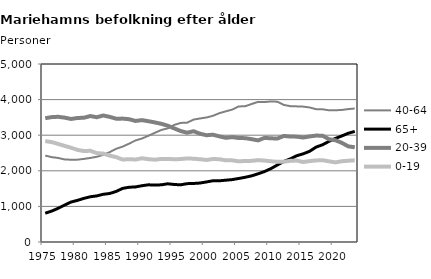
| Category | 40-64 | 65+ | 20-39 | 0-19 |
|---|---|---|---|---|
| 1975.0 | 2428 | 809 | 3478 | 2835 |
| 1976.0 | 2384 | 868 | 3508 | 2806 |
| 1977.0 | 2361 | 946 | 3517 | 2755 |
| 1978.0 | 2319 | 1037 | 3494 | 2700 |
| 1979.0 | 2311 | 1123 | 3456 | 2648 |
| 1980.0 | 2313 | 1169 | 3483 | 2588 |
| 1981.0 | 2334 | 1226 | 3491 | 2555 |
| 1982.0 | 2362 | 1271 | 3538 | 2562 |
| 1983.0 | 2394 | 1295 | 3505 | 2497 |
| 1984.0 | 2447 | 1340 | 3554 | 2483 |
| 1985.0 | 2525 | 1363 | 3515 | 2426 |
| 1986.0 | 2619 | 1420 | 3464 | 2385 |
| 1987.0 | 2679 | 1506 | 3466 | 2315 |
| 1988.0 | 2762 | 1538 | 3450 | 2327 |
| 1989.0 | 2853 | 1547 | 3400 | 2317 |
| 1990.0 | 2907 | 1581 | 3424 | 2351 |
| 1991.0 | 2984 | 1606 | 3393 | 2327 |
| 1992.0 | 3067 | 1600 | 3359 | 2312 |
| 1993.0 | 3147 | 1606 | 3320 | 2333 |
| 1994.0 | 3192 | 1635 | 3267 | 2335 |
| 1995.0 | 3288 | 1616 | 3191 | 2323 |
| 1996.0 | 3345 | 1606 | 3118 | 2330 |
| 1997.0 | 3351 | 1639 | 3070 | 2348 |
| 1998.0 | 3438 | 1644 | 3112 | 2340 |
| 1999.0 | 3470 | 1656 | 3042 | 2324 |
| 2000.0 | 3498 | 1687 | 2999 | 2304 |
| 2001.0 | 3544 | 1720 | 3014 | 2331 |
| 2002.0 | 3619 | 1720 | 2967 | 2326 |
| 2003.0 | 3670 | 1736 | 2926 | 2294 |
| 2004.0 | 3720 | 1753 | 2946 | 2293 |
| 2005.0 | 3808 | 1784 | 2921 | 2267 |
| 2006.0 | 3813 | 1818 | 2917 | 2276 |
| 2007.0 | 3876 | 1858 | 2889 | 2279 |
| 2008.0 | 3936 | 1915 | 2854 | 2300 |
| 2009.0 | 3932 | 1979 | 2925 | 2287 |
| 2010.0 | 3948 | 2062 | 2913 | 2267 |
| 2011.0 | 3941 | 2163 | 2906 | 2253 |
| 2012.0 | 3850 | 2263 | 2978 | 2255 |
| 2013.0 | 3816 | 2335 | 2963 | 2279 |
| 2014.0 | 3810 | 2423 | 2959 | 2288 |
| 2015.0 | 3803 | 2477 | 2935 | 2246 |
| 2016.0 | 3779 | 2548 | 2965 | 2273 |
| 2017.0 | 3731 | 2666 | 2989 | 2291 |
| 2018.0 | 3728 | 2731 | 2986 | 2298 |
| 2019.0 | 3699 | 2827 | 2887 | 2266 |
| 2020.0 | 3700 | 2910 | 2859 | 2236 |
| 2021.0 | 3710 | 2979 | 2784 | 2269 |
| 2022.0 | 3733 | 3055 | 2686 | 2283 |
| 2023.0 | 3750 | 3106 | 2661 | 2295 |